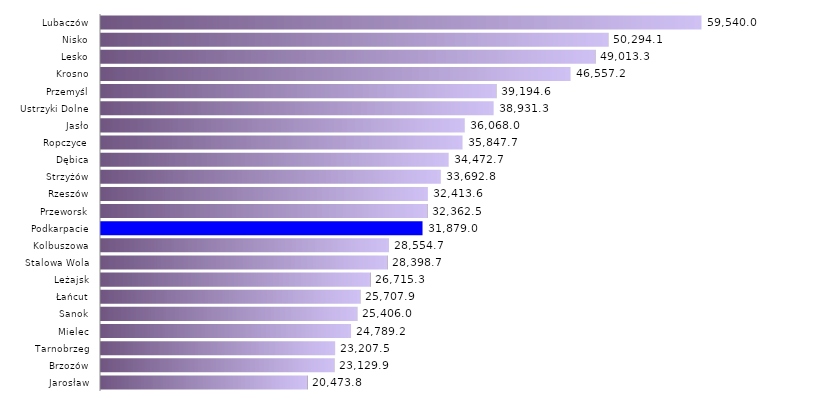
| Category | Dofinansowanie podejmowania działalności gospodarczej |
|---|---|
| Jarosław | 20473.833 |
| Brzozów | 23129.883 |
| Tarnobrzeg | 23207.51 |
| Mielec | 24789.24 |
| Sanok | 25405.97 |
| Łańcut | 25707.865 |
| Leżajsk | 26715.278 |
| Stalowa Wola | 28398.658 |
| Kolbuszowa | 28554.711 |
| Podkarpacie | 31878.975 |
| Przeworsk | 32362.471 |
| Rzeszów | 32413.647 |
| Strzyżów | 33692.759 |
| Dębica | 34472.67 |
| Ropczyce | 35847.708 |
| Jasło | 36068.05 |
| Ustrzyki Dolne | 38931.265 |
| Przemyśl | 39194.64 |
| Krosno | 46557.163 |
| Lesko | 49013.269 |
| Nisko | 50294.118 |
| Lubaczów | 59540.021 |